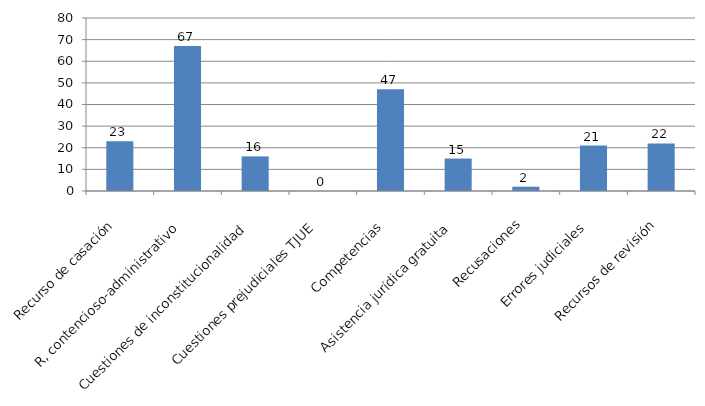
| Category | Series 0 |
|---|---|
| Recurso de casación | 23 |
| R, contencioso-administrativo  | 67 |
| Cuestiones de inconstitucionalidad  | 16 |
| Cuestiones prejudiciales TJUE  | 0 |
| Competencias  | 47 |
| Asistencia jurídica gratuita  | 15 |
| Recusaciones  | 2 |
| Errores judiciales  | 21 |
| Recursos de revisión | 22 |